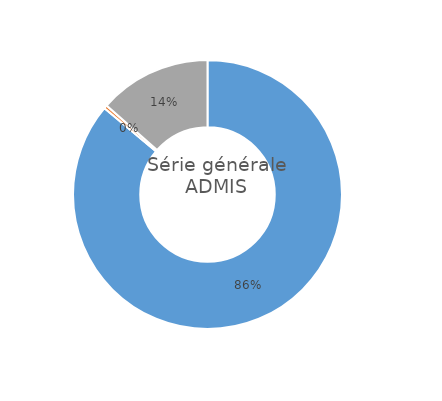
| Category | Series 0 |
|---|---|
| ... ayant validé la maîtrise du socle, et obtenu une moyenne aux épreuves terminales supérieure ou égale à 10/20 | 86.1 |
| ... n'ayant pas validé la maîtrise du socle, et obtenu une moyenne aux épreuves terminales supérieure ou égale à 10/20 | 0.4 |
| ... ayant validé la maîtrise du socle, et obtenu une moyenne aux épreuves terminales inférieure à 10/20 | 13.5 |
| ... n'ayant pas validé la maîtrise du socle, et obtenu une moyenne aux épreuves terminales inférieure à 10/20 | 0 |